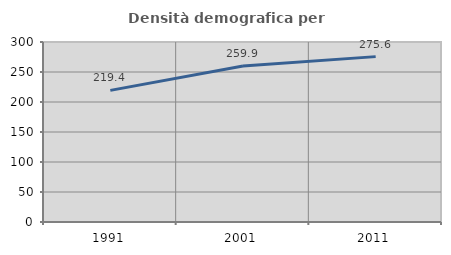
| Category | Densità demografica |
|---|---|
| 1991.0 | 219.415 |
| 2001.0 | 259.876 |
| 2011.0 | 275.619 |